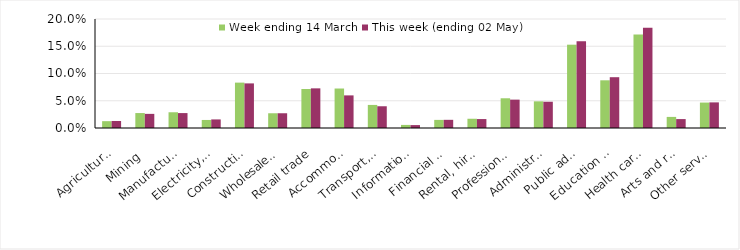
| Category | Week ending 14 March | This week (ending 02 May) |
|---|---|---|
| Agriculture, forestry and fishing | 0.013 | 0.013 |
| Mining | 0.027 | 0.026 |
| Manufacturing | 0.029 | 0.027 |
| Electricity, gas, water and waste services | 0.015 | 0.016 |
| Construction | 0.083 | 0.082 |
| Wholesale trade | 0.027 | 0.027 |
| Retail trade | 0.072 | 0.073 |
| Accommodation and food services | 0.072 | 0.06 |
| Transport, postal and warehousing | 0.042 | 0.04 |
| Information media and telecommunications | 0.006 | 0.005 |
| Financial and insurance services | 0.015 | 0.015 |
| Rental, hiring and real estate services | 0.017 | 0.016 |
| Professional, scientific and technical services | 0.055 | 0.052 |
| Administrative and support services | 0.049 | 0.048 |
| Public administration and safety | 0.153 | 0.159 |
| Education and training | 0.088 | 0.093 |
| Health care and social assistance | 0.171 | 0.184 |
| Arts and recreation services | 0.02 | 0.016 |
| Other services | 0.047 | 0.047 |